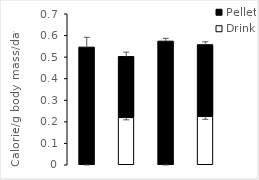
| Category | Drink | Pellet |
|---|---|---|
| 0 | 0 | 0.546 |
| 1 | 0.22 | 0.283 |
| 2 | 0 | 0.574 |
| 3 | 0.225 | 0.333 |